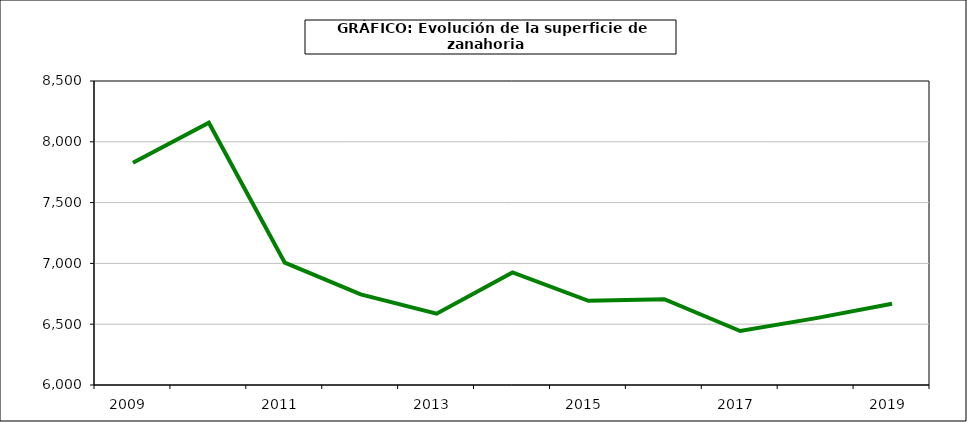
| Category | superficie |
|---|---|
| 2009.0 | 7828 |
| 2010.0 | 8157 |
| 2011.0 | 7006 |
| 2012.0 | 6745 |
| 2013.0 | 6586 |
| 2014.0 | 6926 |
| 2015.0 | 6692 |
| 2016.0 | 6705 |
| 2017.0 | 6444 |
| 2018.0 | 6550 |
| 2019.0 | 6668 |